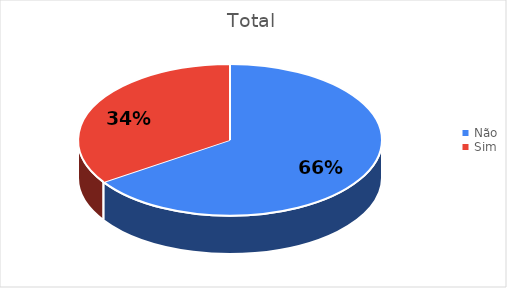
| Category | Total |
|---|---|
| Não | 21 |
| Sim | 11 |